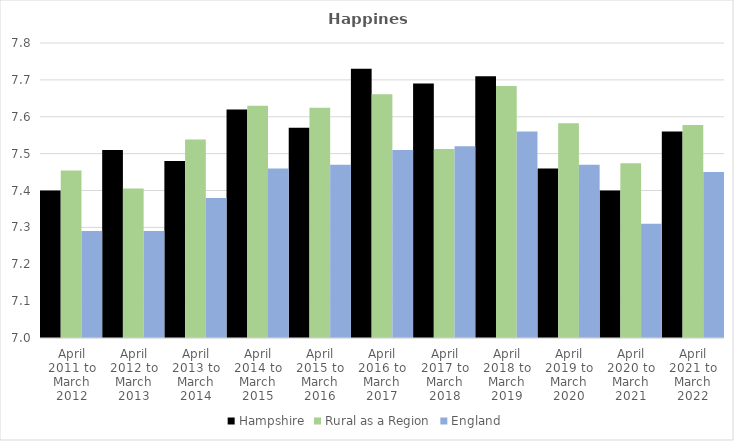
| Category | Hampshire | Rural as a Region | England |
|---|---|---|---|
| April 2011 to March 2012 | 7.4 | 7.454 | 7.29 |
| April 2012 to March 2013 | 7.51 | 7.406 | 7.29 |
| April 2013 to March 2014 | 7.48 | 7.539 | 7.38 |
| April 2014 to March 2015 | 7.62 | 7.63 | 7.46 |
| April 2015 to March 2016 | 7.57 | 7.625 | 7.47 |
| April 2016 to March 2017 | 7.73 | 7.661 | 7.51 |
| April 2017 to March 2018 | 7.69 | 7.513 | 7.52 |
| April 2018 to March 2019 | 7.71 | 7.684 | 7.56 |
| April 2019 to March 2020 | 7.46 | 7.582 | 7.47 |
| April 2020 to March 2021 | 7.4 | 7.474 | 7.31 |
| April 2021 to March 2022 | 7.56 | 7.577 | 7.45 |